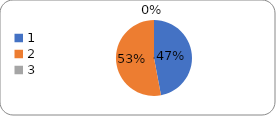
| Category | Series 0 |
|---|---|
| 0 | 48 |
| 1 | 54 |
| 2 | 0 |